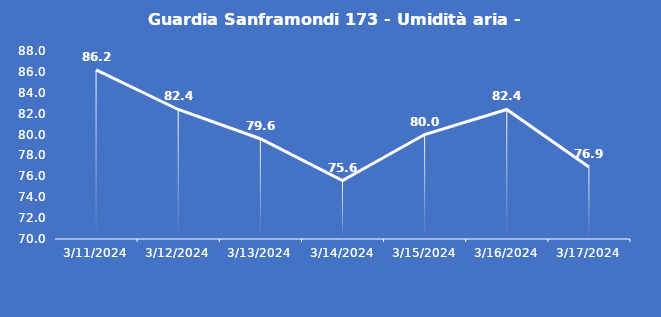
| Category | Guardia Sanframondi 173 - Umidità aria - Grezzo (%) |
|---|---|
| 3/11/24 | 86.2 |
| 3/12/24 | 82.4 |
| 3/13/24 | 79.6 |
| 3/14/24 | 75.6 |
| 3/15/24 | 80 |
| 3/16/24 | 82.4 |
| 3/17/24 | 76.9 |